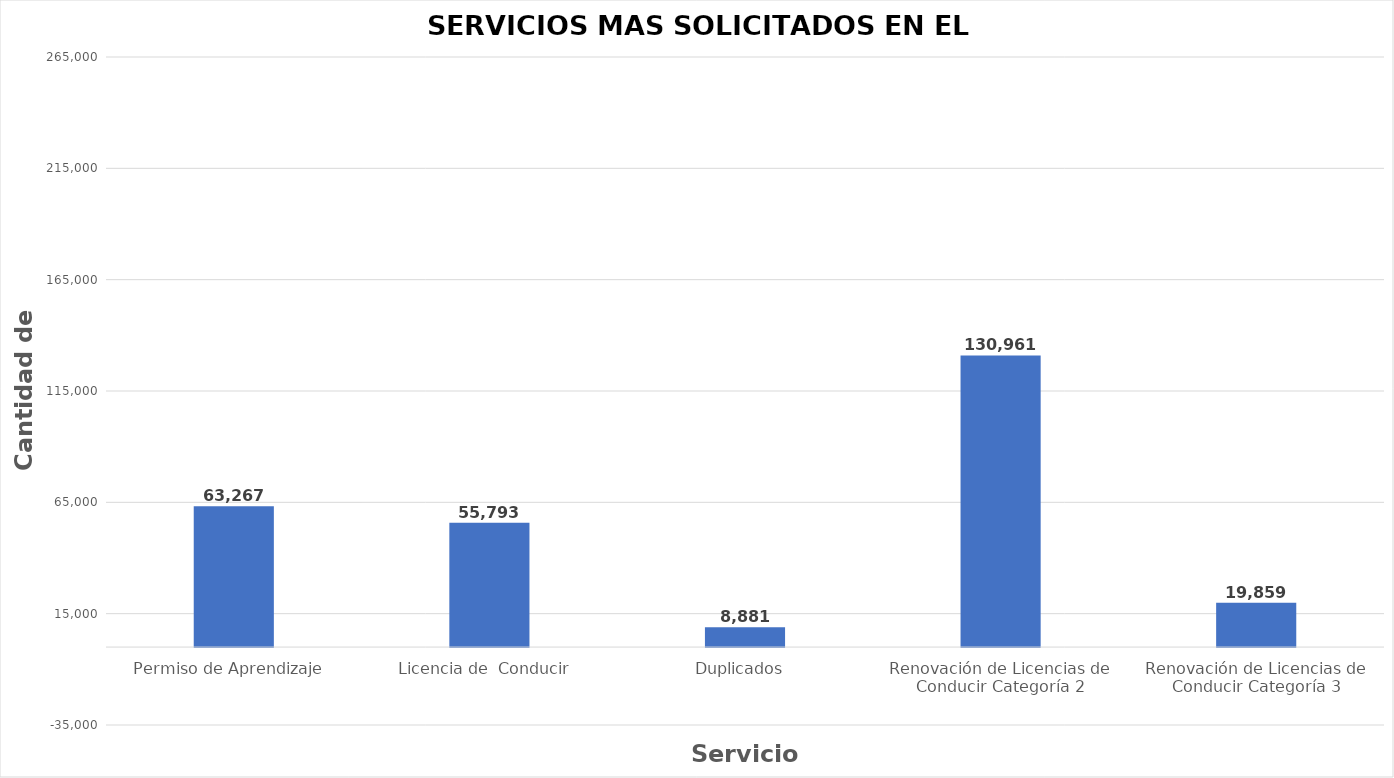
| Category | Series 0 |
|---|---|
| Permiso de Aprendizaje  | 63267 |
| Licencia de  Conducir  | 55793 |
| Duplicados  | 8881 |
| Renovación de Licencias de Conducir Categoría 2 | 130961 |
| Renovación de Licencias de Conducir Categoría 3 | 19859 |